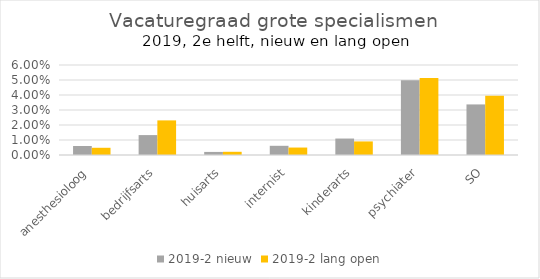
| Category | 2019-2 |
|---|---|
| anesthesioloog | 0.005 |
| bedrijfsarts | 0.023 |
| huisarts | 0.002 |
| internist | 0.005 |
| kinderarts | 0.009 |
| psychiater | 0.051 |
| SO | 0.04 |